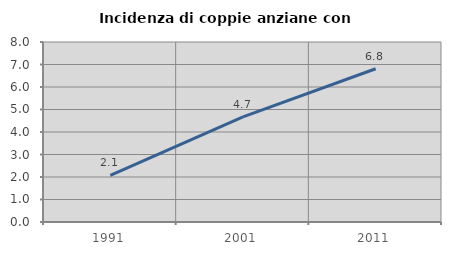
| Category | Incidenza di coppie anziane con figli |
|---|---|
| 1991.0 | 2.073 |
| 2001.0 | 4.673 |
| 2011.0 | 6.812 |